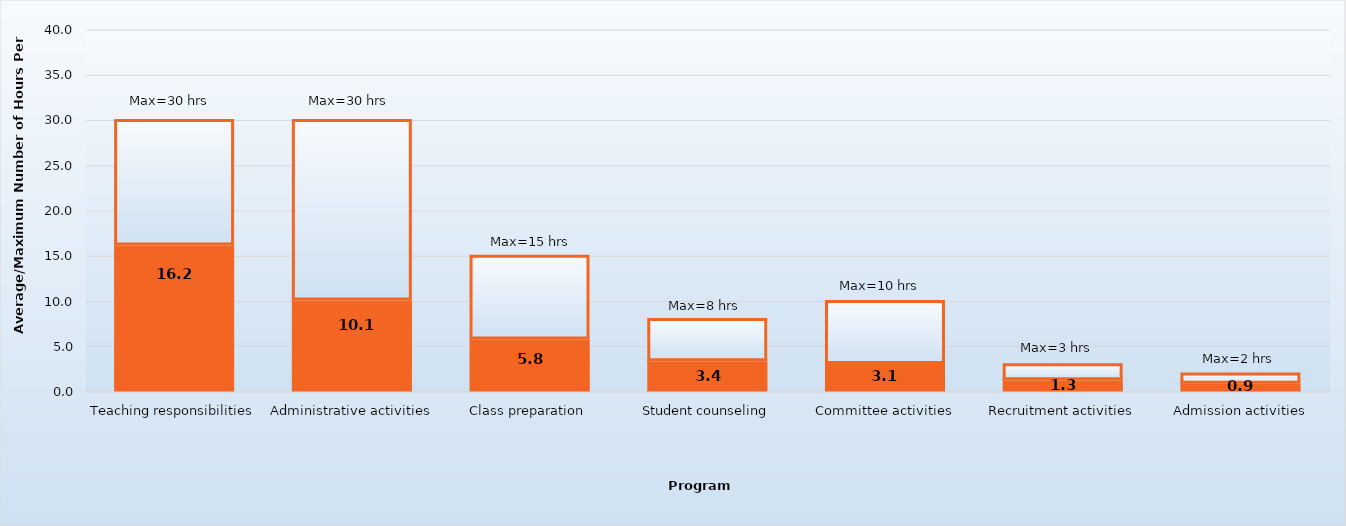
| Category | Average hours per week | Maximum |
|---|---|---|
| Teaching responsibilities | 16.2 | 13.8 |
| Administrative activities | 10.1 | 19.9 |
| Class preparation | 5.8 | 9.2 |
| Student counseling | 3.4 | 4.6 |
| Committee activities | 3.1 | 6.9 |
| Recruitment activities | 1.3 | 1.7 |
| Admission activities | 0.9 | 1.1 |